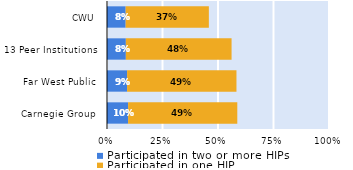
| Category | Participated in two or more HIPs | Participated in one HIP |
|---|---|---|
| Carnegie Group | 0.095 | 0.492 |
| Far West Public | 0.091 | 0.493 |
| 13 Peer Institutions | 0.085 | 0.476 |
| CWU | 0.084 | 0.375 |